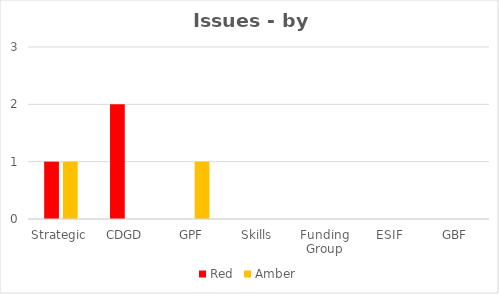
| Category | Red | Amber |
|---|---|---|
| Strategic | 1 | 1 |
| CDGD | 2 | 0 |
| GPF | 0 | 1 |
| Skills | 0 | 0 |
| Funding Group | 0 | 0 |
| ESIF | 0 | 0 |
| GBF | 0 | 0 |